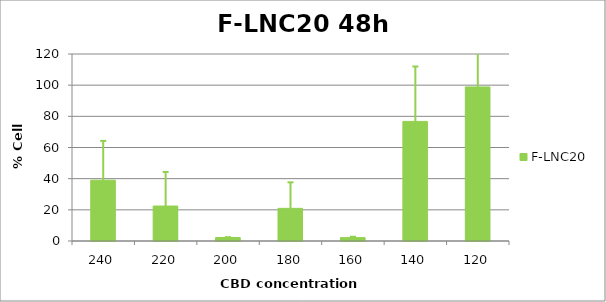
| Category | F-LNC20 |
|---|---|
| 240.0 | 39.028 |
| 220.0 | 22.438 |
| 200.0 | 2.227 |
| 180.0 | 20.946 |
| 160.0 | 2.172 |
| 140.0 | 76.752 |
| 120.0 | 98.866 |